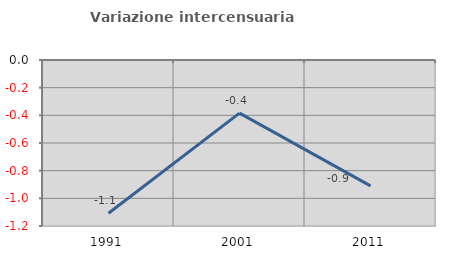
| Category | Variazione intercensuaria annua |
|---|---|
| 1991.0 | -1.108 |
| 2001.0 | -0.384 |
| 2011.0 | -0.91 |